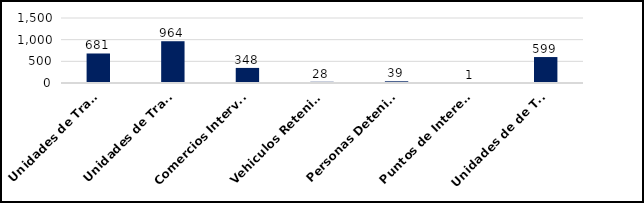
| Category | Series 0 |
|---|---|
| Unidades de Transporte de Combustibles Inspeccionados | 681 |
| Unidades de Transporte de Mercancias Inspeccionadas | 964 |
| Comercios Intervenidos | 348 |
| Vehiculos Retenidos  | 28 |
| Personas Detenidas | 39 |
| Puntos de Interes intervenidos | 1 |
| Unidades de de Transporte Desechos Oleosos Inspeccionadas  | 599 |